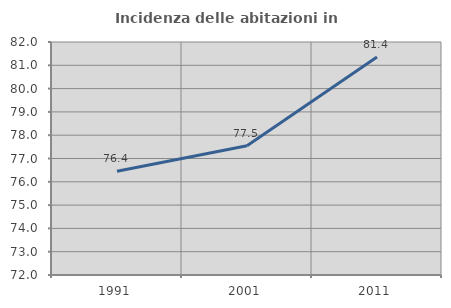
| Category | Incidenza delle abitazioni in proprietà  |
|---|---|
| 1991.0 | 76.449 |
| 2001.0 | 77.547 |
| 2011.0 | 81.359 |